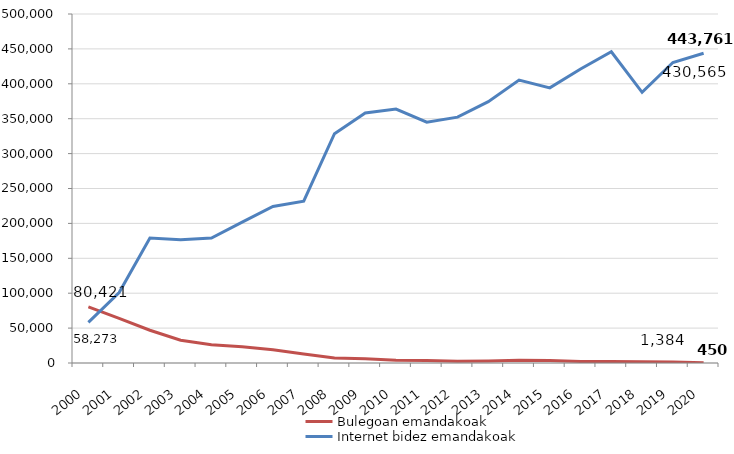
| Category | Bulegoan emandakoak | Internet bidez emandakoak |
|---|---|---|
| 2000.0 | 80421 | 58273 |
| 2001.0 | 64042 | 100869 |
| 2002.0 | 46964 | 178952 |
| 2003.0 | 32720 | 176407 |
| 2004.0 | 26096 | 179107 |
| 2005.0 | 23372 | 201707 |
| 2006.0 | 19115 | 224257 |
| 2007.0 | 12845 | 231868 |
| 2008.0 | 7134 | 328456 |
| 2009.0 | 6070 | 358211 |
| 2010.0 | 3978 | 363757 |
| 2011.0 | 3529 | 344978 |
| 2012.0 | 2560 | 352242 |
| 2013.0 | 2858 | 374439 |
| 2014.0 | 3882 | 405297 |
| 2015.0 | 3470 | 394167 |
| 2016.0 | 2312 | 421304 |
| 2017.0 | 1988 | 445939 |
| 2018.0 | 1779 | 387750 |
| 2019.0 | 1384 | 430565 |
| 2020.0 | 450 | 443761 |